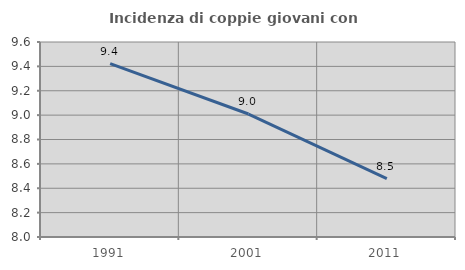
| Category | Incidenza di coppie giovani con figli |
|---|---|
| 1991.0 | 9.422 |
| 2001.0 | 9.009 |
| 2011.0 | 8.48 |